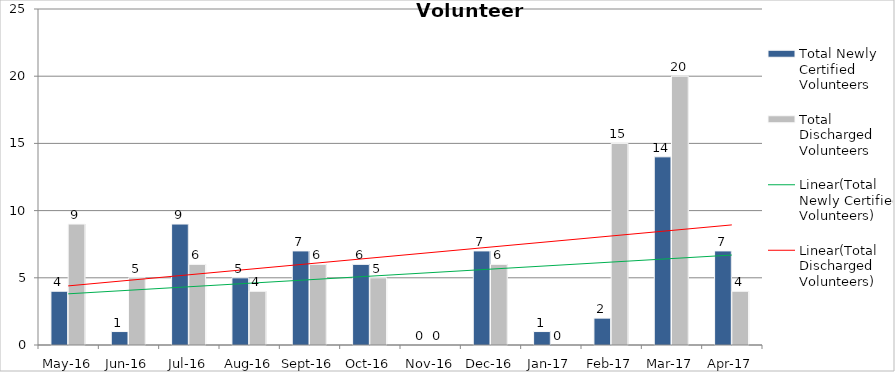
| Category | Total Newly Certified Volunteers | Total Discharged Volunteers |
|---|---|---|
| May-16 | 4 | 9 |
| Jun-16 | 1 | 5 |
| Jul-16 | 9 | 6 |
| Aug-16 | 5 | 4 |
| Sep-16 | 7 | 6 |
| Oct-16 | 6 | 5 |
| Nov-16 | 0 | 0 |
| Dec-16 | 7 | 6 |
| Jan-17 | 1 | 0 |
| Feb-17 | 2 | 15 |
| Mar-17 | 14 | 20 |
| Apr-17 | 7 | 4 |